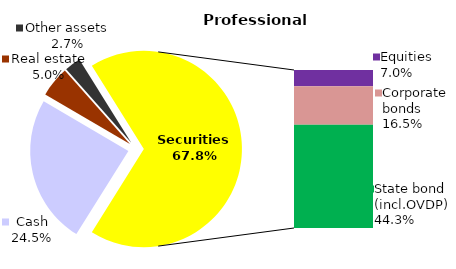
| Category | Professional |
|---|---|
| Cash | 34.472 |
| Bank metals | 0 |
| Real estate | 7.062 |
| Other assets | 3.725 |
| Equities | 9.794 |
| Corporate bonds | 23.159 |
| Municipal bonds | 0 |
| State bond (incl.OVDP) | 62.242 |